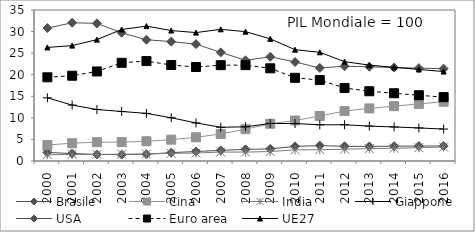
| Category | Brasile | Cina | India | Giappone | USA | Euro area  | UE27 |
|---|---|---|---|---|---|---|---|
| 2000.0 | 1.994 | 3.71 | 1.474 | 14.645 | 30.804 | 19.402 | 26.321 |
| 2001.0 | 1.727 | 4.127 | 1.52 | 12.959 | 32.044 | 19.767 | 26.749 |
| 2002.0 | 1.516 | 4.359 | 1.53 | 11.935 | 31.906 | 20.757 | 28.133 |
| 2003.0 | 1.473 | 4.377 | 1.576 | 11.476 | 29.717 | 22.762 | 30.482 |
| 2004.0 | 1.573 | 4.58 | 1.633 | 11.039 | 28.103 | 23.171 | 31.265 |
| 2005.0 | 1.933 | 4.948 | 1.773 | 10.023 | 27.672 | 22.245 | 30.234 |
| 2006.0 | 2.206 | 5.494 | 1.84 | 8.824 | 27.093 | 21.782 | 29.766 |
| 2007.0 | 2.452 | 6.271 | 2.069 | 7.819 | 25.178 | 22.214 | 30.519 |
| 2008.0 | 2.696 | 7.383 | 2.062 | 7.921 | 23.344 | 22.223 | 29.982 |
| 2009.0 | 2.805 | 8.627 | 2.189 | 8.704 | 24.157 | 21.486 | 28.307 |
| 2010.0 | 3.392 | 9.387 | 2.581 | 8.687 | 22.949 | 19.282 | 25.8 |
| 2011.0 | 3.566 | 10.441 | 2.613 | 8.393 | 21.568 | 18.762 | 25.195 |
| 2012.0 | 3.402 | 11.575 | 2.731 | 8.396 | 21.961 | 16.926 | 23.029 |
| 2013.0 | 3.377 | 12.19 | 2.855 | 8.088 | 21.845 | 16.169 | 22.223 |
| 2014.0 | 3.439 | 12.71 | 2.964 | 7.891 | 21.658 | 15.701 | 21.714 |
| 2015.0 | 3.47 | 13.238 | 3.085 | 7.661 | 21.525 | 15.241 | 21.221 |
| 2016.0 | 3.492 | 13.747 | 3.243 | 7.405 | 21.406 | 14.796 | 20.731 |